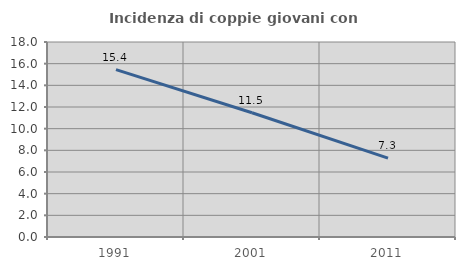
| Category | Incidenza di coppie giovani con figli |
|---|---|
| 1991.0 | 15.449 |
| 2001.0 | 11.469 |
| 2011.0 | 7.276 |